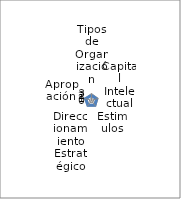
| Category | Series 0 |
|---|---|
| Tipos de Organización | 2.147 |
| Capital Intelectual | 2.271 |
| Estimulos | 2.497 |
| Direccionamiento Estratégico | 2.572 |
| Apropiación  | 2.635 |